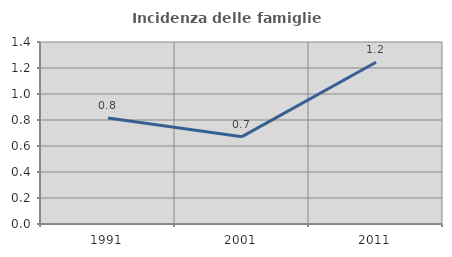
| Category | Incidenza delle famiglie numerose |
|---|---|
| 1991.0 | 0.815 |
| 2001.0 | 0.672 |
| 2011.0 | 1.244 |